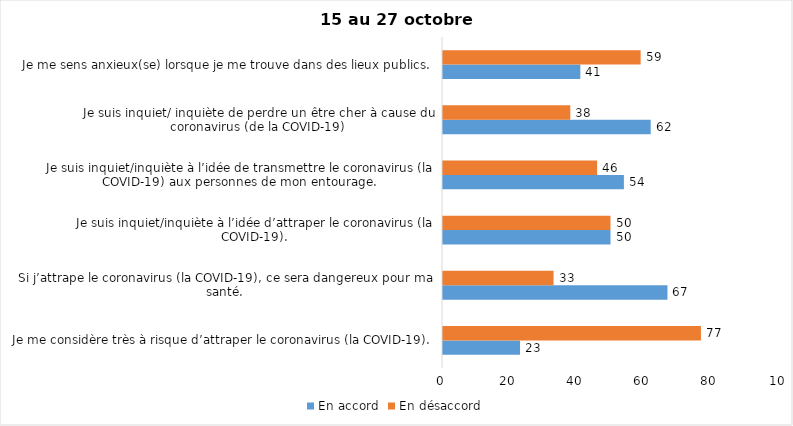
| Category | En accord | En désaccord |
|---|---|---|
| Je me considère très à risque d’attraper le coronavirus (la COVID-19). | 23 | 77 |
| Si j’attrape le coronavirus (la COVID-19), ce sera dangereux pour ma santé. | 67 | 33 |
| Je suis inquiet/inquiète à l’idée d’attraper le coronavirus (la COVID-19). | 50 | 50 |
| Je suis inquiet/inquiète à l’idée de transmettre le coronavirus (la COVID-19) aux personnes de mon entourage. | 54 | 46 |
| Je suis inquiet/ inquiète de perdre un être cher à cause du coronavirus (de la COVID-19) | 62 | 38 |
| Je me sens anxieux(se) lorsque je me trouve dans des lieux publics. | 41 | 59 |